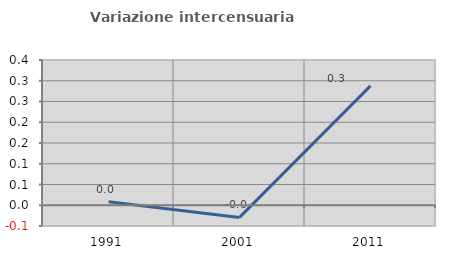
| Category | Variazione intercensuaria annua |
|---|---|
| 1991.0 | 0.008 |
| 2001.0 | -0.029 |
| 2011.0 | 0.288 |